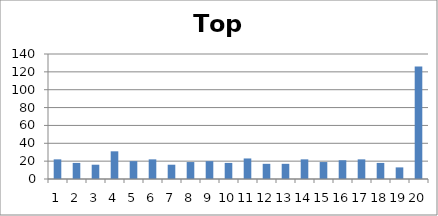
| Category | Top Slice |
|---|---|
| 0 | 22 |
| 1 | 18 |
| 2 | 16 |
| 3 | 31 |
| 4 | 20 |
| 5 | 22 |
| 6 | 16 |
| 7 | 19 |
| 8 | 20 |
| 9 | 18 |
| 10 | 23 |
| 11 | 17 |
| 12 | 17 |
| 13 | 22 |
| 14 | 19 |
| 15 | 21 |
| 16 | 22 |
| 17 | 18 |
| 18 | 13 |
| 19 | 126 |